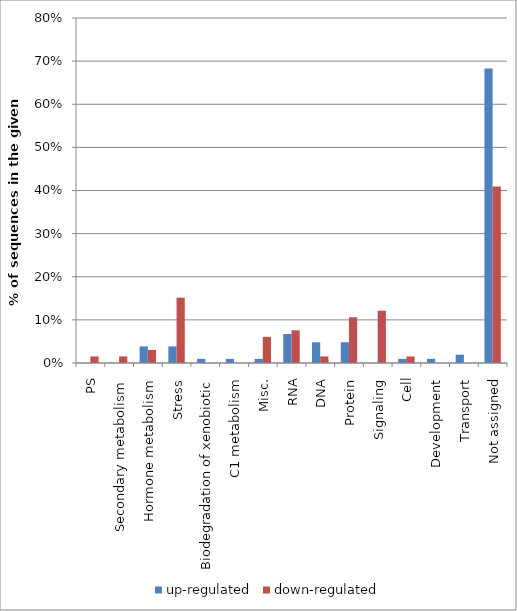
| Category | up-regulated | down-regulated |
|---|---|---|
| PS | 0 | 0.015 |
| Secondary metabolism | 0 | 0.015 |
| Hormone metabolism | 0.038 | 0.03 |
| Stress | 0.038 | 0.152 |
| Biodegradation of xenobiotic | 0.01 | 0 |
| C1 metabolism | 0.01 | 0 |
| Misc. | 0.01 | 0.061 |
| RNA | 0.067 | 0.076 |
| DNA | 0.048 | 0.015 |
| Protein | 0.048 | 0.106 |
| Signaling | 0 | 0.121 |
| Cell | 0.01 | 0.015 |
| Development | 0.01 | 0 |
| Transport | 0.019 | 0 |
| Not assigned | 0.683 | 0.409 |